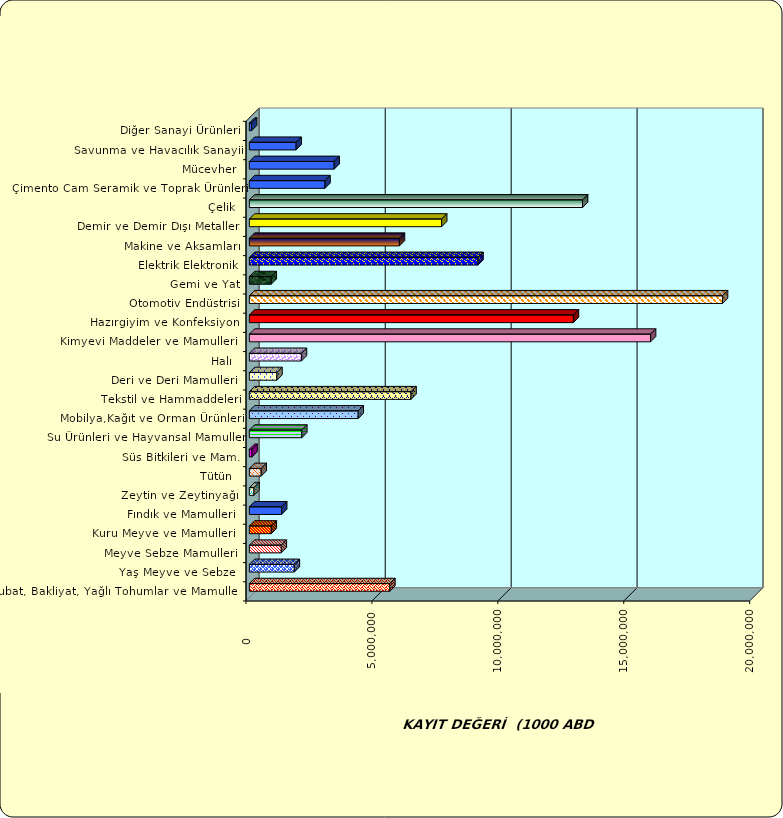
| Category | Series 0 |
|---|---|
|  Hububat, Bakliyat, Yağlı Tohumlar ve Mamulleri  | 5579519.713 |
|  Yaş Meyve ve Sebze   | 1786117.137 |
|  Meyve Sebze Mamulleri  | 1268276.2 |
|  Kuru Meyve ve Mamulleri   | 870535.495 |
|  Fındık ve Mamulleri  | 1282261.924 |
|  Zeytin ve Zeytinyağı  | 184225.572 |
|  Tütün  | 469950.502 |
|  Süs Bitkileri ve Mam. | 107116.123 |
|  Su Ürünleri ve Hayvansal Mamuller | 2082758.988 |
|  Mobilya,Kağıt ve Orman Ürünleri | 4322651.25 |
|  Tekstil ve Hammaddeleri | 6419452.898 |
|  Deri ve Deri Mamulleri  | 1095217.462 |
|  Halı  | 2069305.55 |
|  Kimyevi Maddeler ve Mamulleri   | 15930376.939 |
|  Hazırgiyim ve Konfeksiyon  | 12867653.489 |
|  Otomotiv Endüstrisi | 18787958.326 |
|  Gemi ve Yat | 869583.874 |
|  Elektrik Elektronik | 9079969.65 |
|  Makine ve Aksamları | 5959641.191 |
|  Demir ve Demir Dışı Metaller  | 7635780.635 |
|  Çelik | 13232075.283 |
|  Çimento Cam Seramik ve Toprak Ürünleri | 3002775.007 |
|  Mücevher | 3368933.854 |
|  Savunma ve Havacılık Sanayii | 1857123.473 |
|  Diğer Sanayi Ürünleri | 86822.063 |